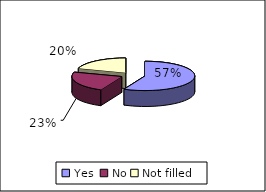
| Category | Prior to the procedure you were given an anaesthetic - did this work |
|---|---|
| Yes  | 82 |
| No | 33 |
| Not filled | 29 |